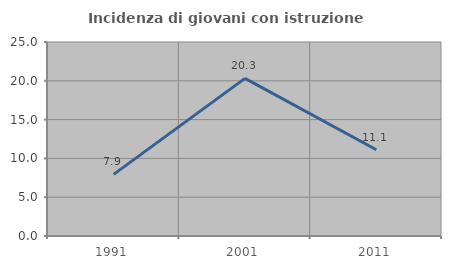
| Category | Incidenza di giovani con istruzione universitaria |
|---|---|
| 1991.0 | 7.937 |
| 2001.0 | 20.312 |
| 2011.0 | 11.111 |